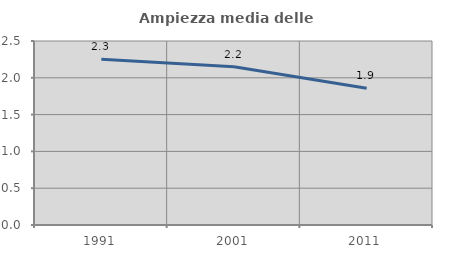
| Category | Ampiezza media delle famiglie |
|---|---|
| 1991.0 | 2.253 |
| 2001.0 | 2.151 |
| 2011.0 | 1.858 |